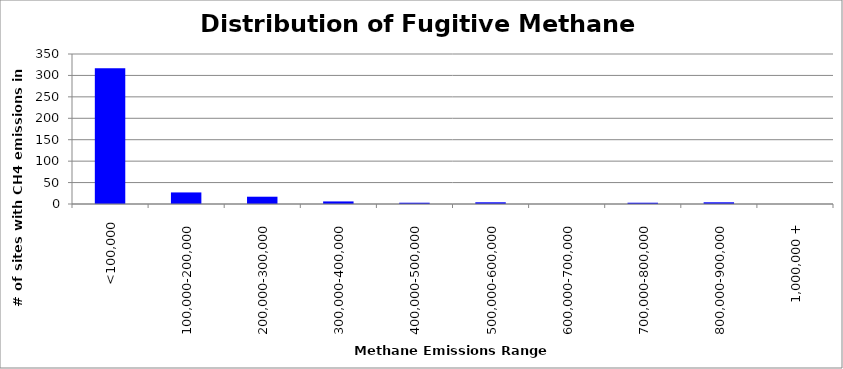
| Category | Series 0 |
|---|---|
| <100,000 | 317 |
| 100,000-200,000 | 27 |
| 200,000-300,000 | 17 |
| 300,000-400,000 | 6 |
| 400,000-500,000 | 3 |
| 500,000-600,000 | 4 |
| 600,000-700,000 | 0 |
| 700,000-800,000 | 3 |
| 800,000-900,000 | 4 |
| 1,000,000 + | 0 |